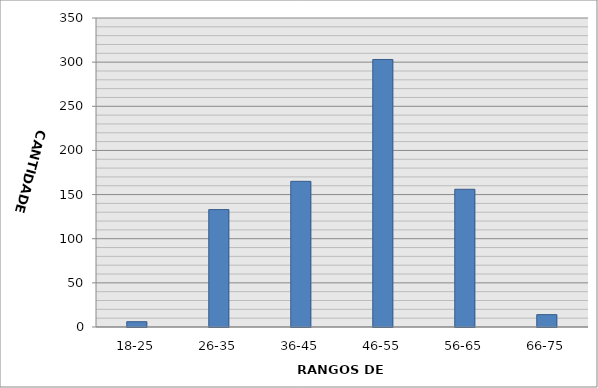
| Category | Series 0 |
|---|---|
| 18-25 | 6 |
| 26-35 | 133 |
| 36-45 | 165 |
| 46-55 | 303 |
| 56-65 | 156 |
| 66-75 | 14 |